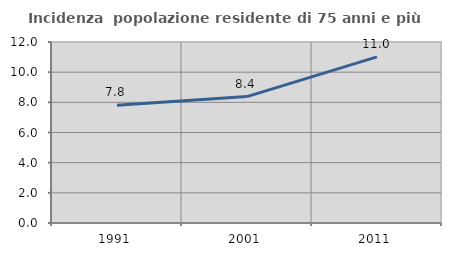
| Category | Incidenza  popolazione residente di 75 anni e più |
|---|---|
| 1991.0 | 7.804 |
| 2001.0 | 8.381 |
| 2011.0 | 11.011 |